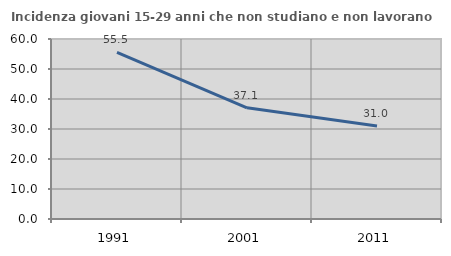
| Category | Incidenza giovani 15-29 anni che non studiano e non lavorano  |
|---|---|
| 1991.0 | 55.511 |
| 2001.0 | 37.055 |
| 2011.0 | 30.978 |